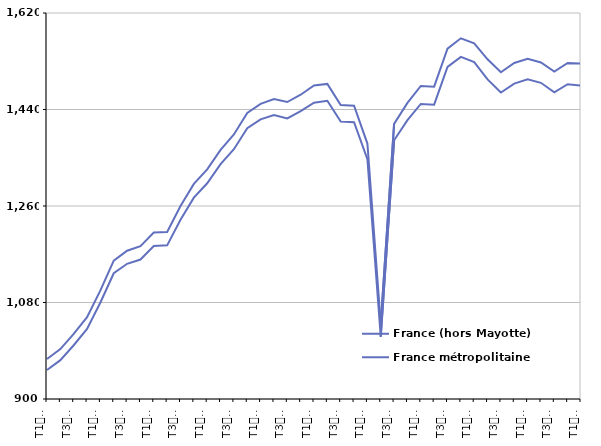
| Category | France (hors Mayotte) | France métropolitaine |
|---|---|---|
| T1
2014 | 974.5 | 954.1 |
| T2
2014 | 993.1 | 972.5 |
| T3
2014 | 1021.5 | 1000.3 |
| T4
2014 | 1052.7 | 1030.7 |
| T1
2015 | 1102.5 | 1080.1 |
| T2
2015 | 1158.1 | 1134.5 |
| T3
2015 | 1176.5 | 1152.2 |
| T4
2015 | 1185.1 | 1160.2 |
| T1
2016 | 1210.4 | 1185.2 |
| T2
2016 | 1211.4 | 1186.6 |
| T3
2016 | 1259.8 | 1234.3 |
| T4
2016 | 1301.2 | 1275.5 |
| T1
2017 | 1328.3 | 1302.4 |
| T2
2017 | 1364.8 | 1338.2 |
| T3
2017 | 1393.5 | 1366 |
| T4
2017 | 1433.6 | 1405.2 |
| T1
2018 | 1450.6 | 1421.7 |
| T2
2018 | 1459.5 | 1429.5 |
| T3
2018 | 1453.9 | 1423.4 |
| T4
2018 | 1467.6 | 1437 |
| T1
2019 | 1484.7 | 1452.7 |
| T2
2019 | 1487.7 | 1456.3 |
| T3
2019 | 1448.4 | 1417.5 |
| T4
2019 | 1447.1 | 1416.3 |
| T1
2020 | 1376.5 | 1347.5 |
| T2
2020 | 1039.8 | 1016.1 |
| T3
2020 | 1413.1 | 1382.7 |
| T4
2020 | 1452.4 | 1420.2 |
| T1
2021 | 1483.9 | 1450.3 |
| T2
2021 | 1482.6 | 1449 |
| T3
2021 | 1553.5 | 1519.3 |
| T4
2021 | 1572.8 | 1538.2 |
| T1
2022 | 1563.6 | 1528.5 |
| T2
2022 | 1533.6 | 1496.1 |
| T3
2022 | 1509.5 | 1471.6 |
| T4
2022 | 1526.7 | 1488.2 |
| T1
2023 | 1534.6 | 1496.2 |
| T2
2023 | 1527.8 | 1489.8 |
| T3
2023 | 1510.7 | 1472.1 |
| T4
2023 | 1526.9 | 1487.2 |
| T1
2024 | 1525.6 | 1484.8 |